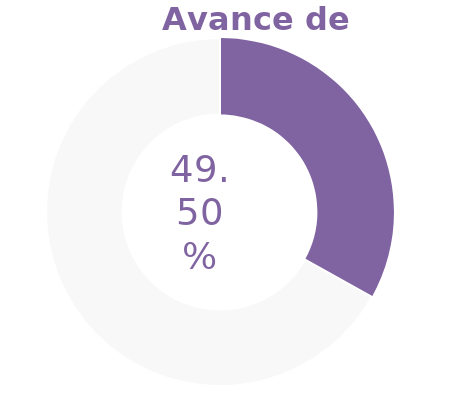
| Category | Series 0 |
|---|---|
| Acumulado 1 Trimestre | 0.495 |
| Año | -1 |